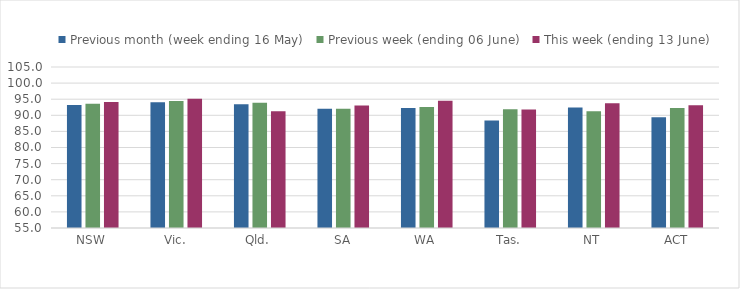
| Category | Previous month (week ending 16 May) | Previous week (ending 06 June) | This week (ending 13 June) |
|---|---|---|---|
| NSW | 93.233 | 93.591 | 94.103 |
| Vic. | 94.017 | 94.434 | 95.134 |
| Qld. | 93.427 | 93.883 | 91.231 |
| SA | 91.998 | 92.04 | 93.052 |
| WA | 92.301 | 92.582 | 94.525 |
| Tas. | 88.405 | 91.848 | 91.8 |
| NT | 92.453 | 91.292 | 93.71 |
| ACT | 89.422 | 92.262 | 93.109 |